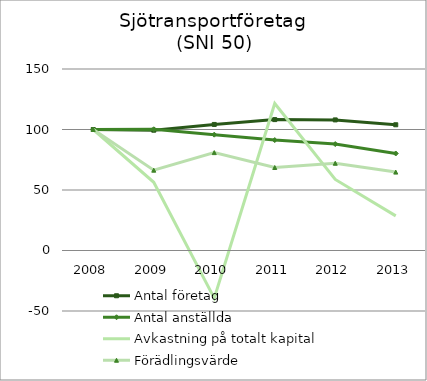
| Category | Antal företag | Antal anställda | Avkastning på totalt kapital | Förädlingsvärde |
|---|---|---|---|---|
| 2008.0 | 100 | 100 | 100 | 100 |
| 2009.0 | 99.416 | 100.183 | 56.354 | 66.386 |
| 2010.0 | 104.174 | 95.733 | -39.32 | 80.898 |
| 2011.0 | 108.18 | 91.277 | 121.524 | 68.585 |
| 2012.0 | 107.93 | 87.96 | 58.741 | 72.084 |
| 2013.0 | 103.923 | 80.172 | 28.632 | 64.789 |